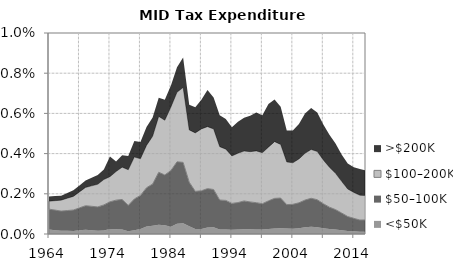
| Category | <$50K | $50–100K | $100–200K | >$200K |
|---|---|---|---|---|
| 1964.0 | 0 | 0.001 | 0 | 0 |
| 1965.0 | 0 | 0.001 | 0 | 0 |
| 1966.0 | 0 | 0.001 | 0.001 | 0 |
| 1967.0 | 0 | 0.001 | 0.001 | 0 |
| 1968.0 | 0 | 0.001 | 0.001 | 0 |
| 1969.0 | 0 | 0.001 | 0.001 | 0 |
| 1970.0 | 0 | 0.001 | 0.001 | 0 |
| 1971.0 | 0 | 0.001 | 0.001 | 0 |
| 1972.0 | 0 | 0.001 | 0.001 | 0 |
| 1973.0 | 0 | 0.001 | 0.001 | 0 |
| 1974.0 | 0 | 0.001 | 0.001 | 0.001 |
| 1975.0 | 0 | 0.001 | 0.001 | 0.001 |
| 1976.0 | 0 | 0.001 | 0.002 | 0.001 |
| 1977.0 | 0 | 0.001 | 0.002 | 0.001 |
| 1978.0 | 0 | 0.002 | 0.002 | 0.001 |
| 1979.0 | 0 | 0.002 | 0.002 | 0.001 |
| 1980.0 | 0 | 0.002 | 0.002 | 0.001 |
| 1981.0 | 0 | 0.002 | 0.002 | 0.001 |
| 1982.0 | 0 | 0.003 | 0.003 | 0.001 |
| 1983.0 | 0 | 0.003 | 0.003 | 0.001 |
| 1984.0 | 0 | 0.003 | 0.003 | 0.001 |
| 1985.0 | 0.001 | 0.003 | 0.003 | 0.001 |
| 1986.0 | 0.001 | 0.003 | 0.004 | 0.001 |
| 1987.0 | 0 | 0.002 | 0.003 | 0.001 |
| 1988.0 | 0 | 0.002 | 0.003 | 0.001 |
| 1989.0 | 0 | 0.002 | 0.003 | 0.001 |
| 1990.0 | 0 | 0.002 | 0.003 | 0.002 |
| 1991.0 | 0 | 0.002 | 0.003 | 0.002 |
| 1992.0 | 0 | 0.001 | 0.003 | 0.002 |
| 1993.0 | 0 | 0.001 | 0.003 | 0.002 |
| 1994.0 | 0 | 0.001 | 0.002 | 0.001 |
| 1995.0 | 0 | 0.001 | 0.002 | 0.002 |
| 1996.0 | 0 | 0.001 | 0.002 | 0.002 |
| 1997.0 | 0 | 0.001 | 0.003 | 0.002 |
| 1998.0 | 0 | 0.001 | 0.003 | 0.002 |
| 1999.0 | 0 | 0.001 | 0.003 | 0.002 |
| 2000.0 | 0 | 0.001 | 0.003 | 0.002 |
| 2001.0 | 0 | 0.002 | 0.003 | 0.002 |
| 2002.0 | 0 | 0.002 | 0.003 | 0.002 |
| 2003.0 | 0 | 0.001 | 0.002 | 0.002 |
| 2004.0 | 0 | 0.001 | 0.002 | 0.002 |
| 2005.0 | 0 | 0.001 | 0.002 | 0.002 |
| 2006.0 | 0 | 0.001 | 0.002 | 0.002 |
| 2007.0 | 0 | 0.001 | 0.002 | 0.002 |
| 2008.0 | 0 | 0.001 | 0.002 | 0.002 |
| 2009.0 | 0 | 0.001 | 0.002 | 0.002 |
| 2010.0 | 0 | 0.001 | 0.002 | 0.002 |
| 2011.0 | 0 | 0.001 | 0.002 | 0.001 |
| 2012.0 | 0 | 0.001 | 0.002 | 0.001 |
| 2013.0 | 0 | 0.001 | 0.001 | 0.001 |
| 2014.0 | 0 | 0.001 | 0.001 | 0.001 |
| 2015.0 | 0 | 0.001 | 0.001 | 0.001 |
| 2016.0 | 0 | 0.001 | 0.001 | 0.001 |